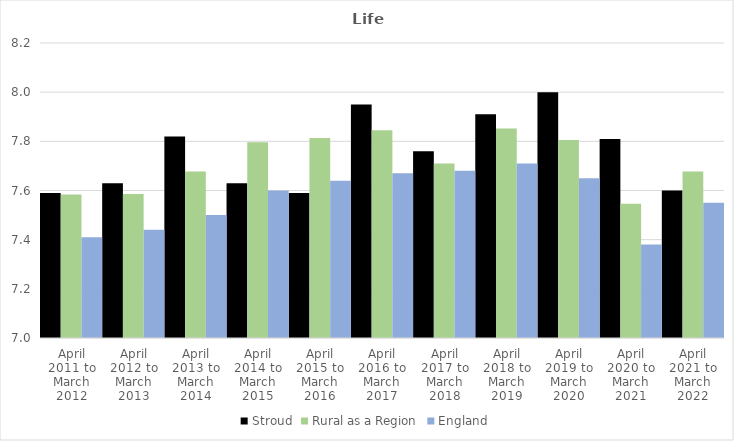
| Category | Stroud | Rural as a Region | England |
|---|---|---|---|
| April 2011 to March 2012 | 7.59 | 7.584 | 7.41 |
| April 2012 to March 2013 | 7.63 | 7.586 | 7.44 |
| April 2013 to March 2014 | 7.82 | 7.677 | 7.5 |
| April 2014 to March 2015 | 7.63 | 7.797 | 7.6 |
| April 2015 to March 2016 | 7.59 | 7.813 | 7.64 |
| April 2016 to March 2017 | 7.95 | 7.845 | 7.67 |
| April 2017 to March 2018 | 7.76 | 7.71 | 7.68 |
| April 2018 to March 2019 | 7.91 | 7.852 | 7.71 |
| April 2019 to March 2020 | 8 | 7.806 | 7.65 |
| April 2020 to March 2021 | 7.81 | 7.546 | 7.38 |
| April 2021 to March 2022 | 7.6 | 7.677 | 7.55 |